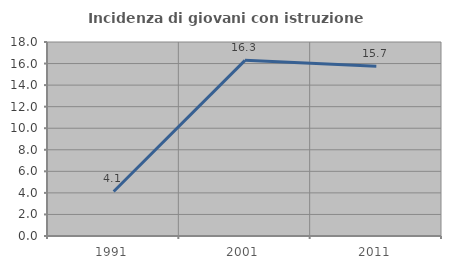
| Category | Incidenza di giovani con istruzione universitaria |
|---|---|
| 1991.0 | 4.132 |
| 2001.0 | 16.296 |
| 2011.0 | 15.748 |